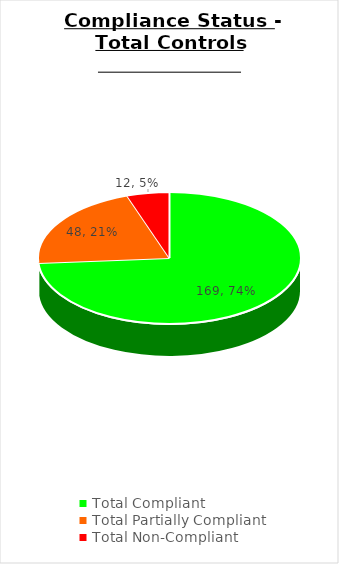
| Category | Series 0 |
|---|---|
| Total Compliant | 169 |
| Total Partially Compliant | 48 |
| Total Non-Compliant | 12 |